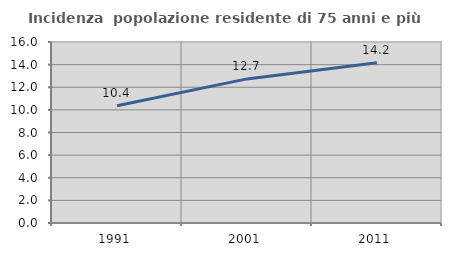
| Category | Incidenza  popolazione residente di 75 anni e più |
|---|---|
| 1991.0 | 10.362 |
| 2001.0 | 12.739 |
| 2011.0 | 14.174 |